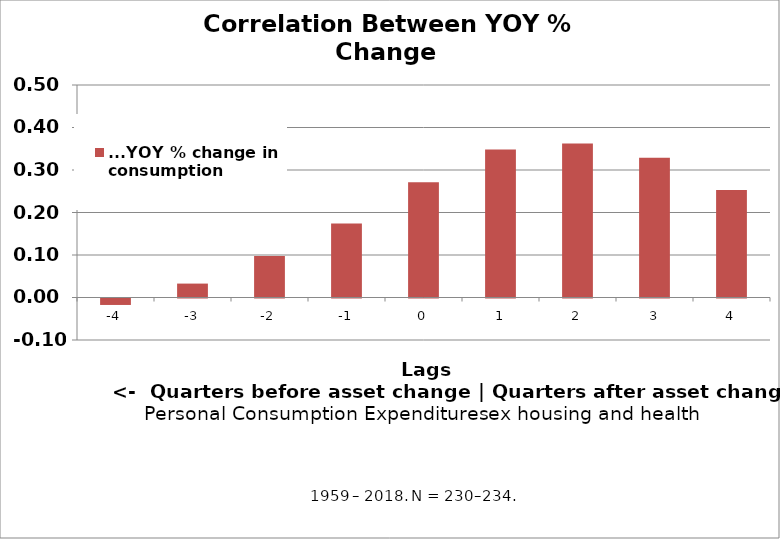
| Category | ...YOY % change in consumption |
|---|---|
| -4.0 | -0.015 |
| -3.0 | 0.033 |
| -2.0 | 0.098 |
| -1.0 | 0.174 |
| 0.0 | 0.271 |
| 1.0 | 0.348 |
| 2.0 | 0.363 |
| 3.0 | 0.329 |
| 4.0 | 0.253 |